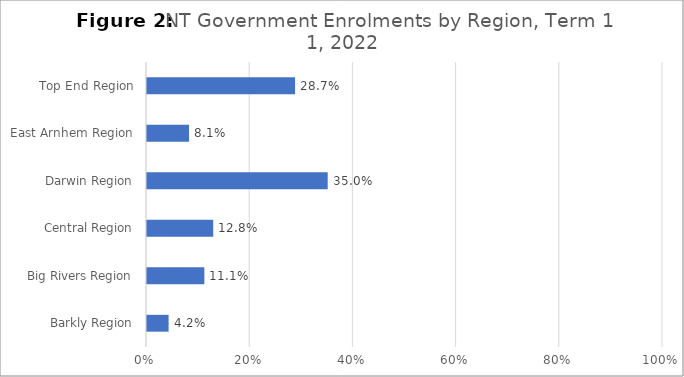
| Category | Series 0 |
|---|---|
| Barkly Region | 0.042 |
| Big Rivers Region | 0.111 |
| Central Region | 0.128 |
| Darwin Region | 0.35 |
| East Arnhem Region | 0.081 |
| Top End Region | 0.287 |